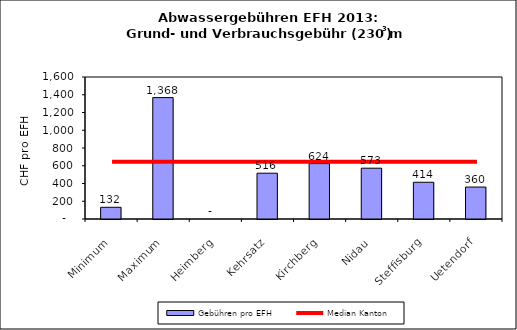
| Category | Gebühren pro EFH |
|---|---|
| Minimum | 132 |
| Maximum | 1368 |
| Heimberg | 0 |
| Kehrsatz | 516 |
| Kirchberg | 624 |
| Nidau | 572.5 |
| Steffisburg | 414 |
| Uetendorf | 360 |